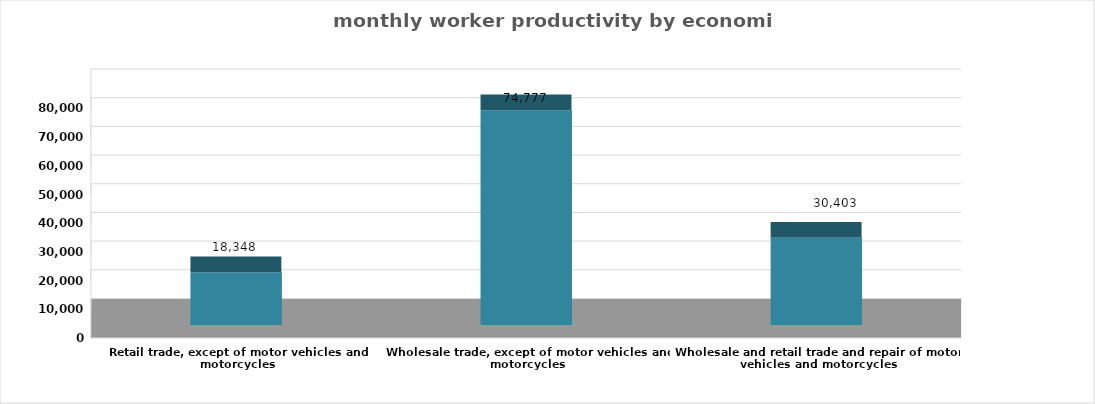
| Category | إنتاجية المشتغل  |
|---|---|
| Wholesale and retail trade and repair of motor vehicles and motorcycles | 30403 |
| Wholesale trade, except of motor vehicles and motorcycles | 74777 |
| Retail trade, except of motor vehicles and motorcycles | 18348 |